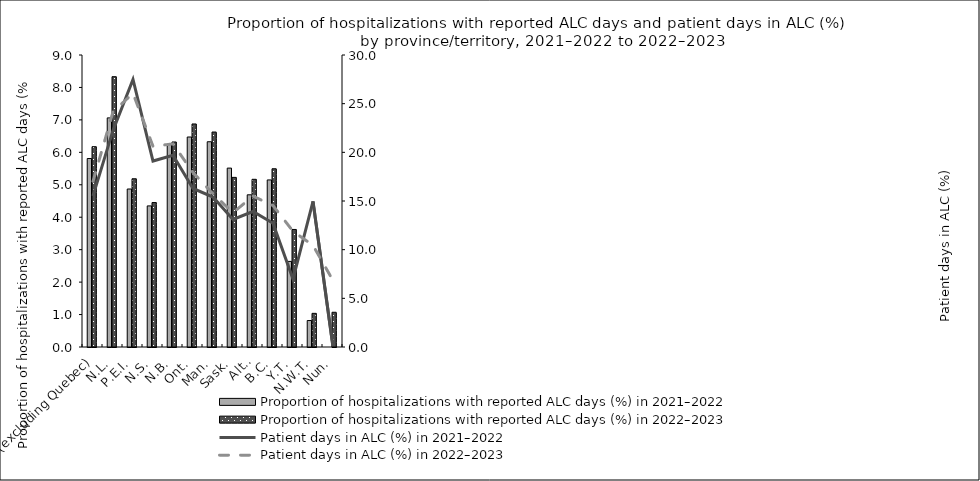
| Category | Proportion of hospitalizations with reported ALC days (%) in 2021–2022 | Proportion of hospitalizations with reported ALC days (%) in 2022–2023 |
|---|---|---|
| 0 | 5.81 | 6.174 |
| 1 | 7.062 | 8.331 |
| 2 | 4.87 | 5.185 |
| 3 | 4.349 | 4.452 |
| 4 | 6.258 | 6.319 |
| 5 | 6.472 | 6.874 |
| 6 | 6.326 | 6.626 |
| 7 | 5.514 | 5.228 |
| 8 | 4.691 | 5.169 |
| 9 | 5.149 | 5.494 |
| 10 | 2.638 | 3.623 |
| 11 | 0.816 | 1.037 |
| 12 | 0 | 1.071 |